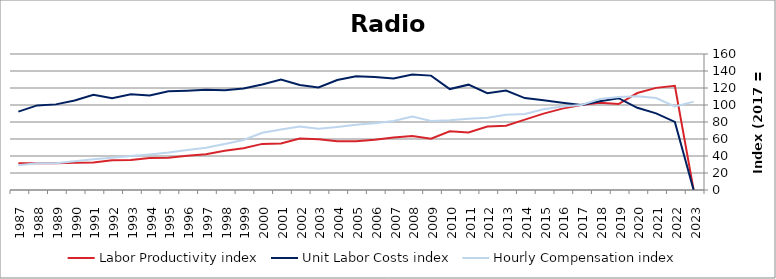
| Category | Labor Productivity index | Unit Labor Costs index | Hourly Compensation index |
|---|---|---|---|
| 2023.0 | 0 | 0 | 103.946 |
| 2022.0 | 122.627 | 80.129 | 98.259 |
| 2021.0 | 120.156 | 90.099 | 108.26 |
| 2020.0 | 114.068 | 96.71 | 110.315 |
| 2019.0 | 101.171 | 108.034 | 109.298 |
| 2018.0 | 102.578 | 104.363 | 107.054 |
| 2017.0 | 100 | 100 | 100 |
| 2016.0 | 95.716 | 102.734 | 98.333 |
| 2015.0 | 89.877 | 105.657 | 94.961 |
| 2014.0 | 82.794 | 108.129 | 89.525 |
| 2013.0 | 75.662 | 116.911 | 88.457 |
| 2012.0 | 74.734 | 113.925 | 85.141 |
| 2011.0 | 67.617 | 123.93 | 83.797 |
| 2010.0 | 69.105 | 118.744 | 82.058 |
| 2009.0 | 60.345 | 134.577 | 81.211 |
| 2008.0 | 63.484 | 135.951 | 86.307 |
| 2007.0 | 61.858 | 131.064 | 81.073 |
| 2006.0 | 59.154 | 132.965 | 78.654 |
| 2005.0 | 57.333 | 133.803 | 76.713 |
| 2004.0 | 57.328 | 129.345 | 74.151 |
| 2003.0 | 59.777 | 120.552 | 72.062 |
| 2002.0 | 60.519 | 123.5 | 74.741 |
| 2001.0 | 54.642 | 130.06 | 71.068 |
| 2000.0 | 54.241 | 124.146 | 67.338 |
| 1999.0 | 49.215 | 119.538 | 58.831 |
| 1998.0 | 46.185 | 117.404 | 54.222 |
| 1997.0 | 42.179 | 117.961 | 49.755 |
| 1996.0 | 40.208 | 116.883 | 46.996 |
| 1995.0 | 37.939 | 116.213 | 44.09 |
| 1994.0 | 37.58 | 111.29 | 41.823 |
| 1993.0 | 35.434 | 112.618 | 39.905 |
| 1992.0 | 35.07 | 107.961 | 37.862 |
| 1991.0 | 32.222 | 111.913 | 36.061 |
| 1990.0 | 32.026 | 105.366 | 33.745 |
| 1989.0 | 31.372 | 100.737 | 31.603 |
| 1988.0 | 31.592 | 99.513 | 31.438 |
| 1987.0 | 31.542 | 92.241 | 29.094 |